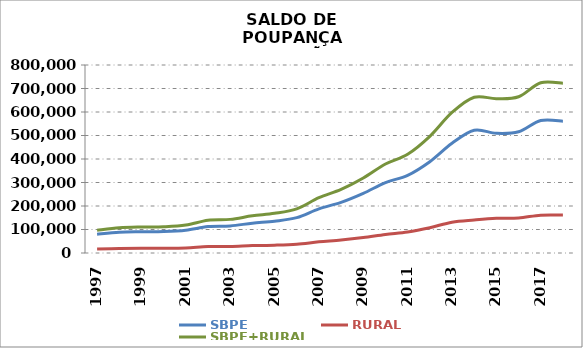
| Category | SBPE | RURAL | SBPE+RURAL |
|---|---|---|---|
| 1997 | 80250.377 | 16813.562 | 97063.939 |
| 1998 | 88538.349 | 18883.24 | 107421.589 |
| 1999 | 90437.74 | 20294.123 | 110731.863 |
| 2000 | 91430.45 | 20310.891 | 111741.341 |
| 2001 | 97146.25 | 21552.598 | 118698.848 |
| 2002 | 112423.444 | 27219.068 | 139642.512 |
| 2003 | 115258.021 | 27799.406 | 143057.427 |
| 2004 | 126853.217 | 31413.354 | 158266.571 |
| 2005 | 135411.681 | 33322.74 | 168734.421 |
| 2006 | 150412.546 | 37523.193 | 187935.739 |
| 2007 | 187827.264 | 47434.388 | 235261.652 |
| 2008 | 215400.282 | 54995.458 | 270395.74 |
| 2009 | 253604.98 | 65477.998 | 319082.978 |
| 2010 | 299878.217 | 78920.574 | 378798.791 |
| 2011 | 330569.272 | 89439.722 | 420008.994 |
| 2012 | 388641.662 | 107660.772 | 496302.434 |
| 2013 | 466788.644 | 131154.416 | 597943.06 |
| 2014 | 522343.501 | 140383.609 | 662727.11 |
| 2015 | 509223.044 | 147366.727 | 656589.771 |
| 2016 | 515955.43 | 149036.994 | 664992.424 |
| 2017 | 563741.675 | 160861.771 | 724603.446 |
| 2018* | 561067.029 | 161296.625 | 722363.654 |